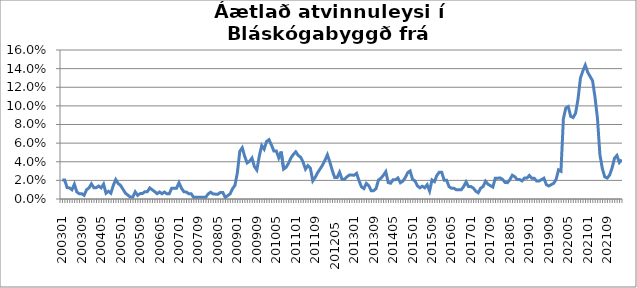
| Category | Series 0 |
|---|---|
| 200301 | 0.02 |
| 200302 | 0.02 |
| 200303 | 0.012 |
| 200304 | 0.012 |
| 200305 | 0.01 |
| 200306 | 0.016 |
| 200307 | 0.008 |
| 200308 | 0.006 |
| 200309 | 0.006 |
| 200310 | 0.004 |
| 200311 | 0.01 |
| 200312 | 0.012 |
| 200401 | 0.016 |
| 200402 | 0.012 |
| 200403 | 0.012 |
| 200404 | 0.014 |
| 200405 | 0.012 |
| 200406 | 0.016 |
| 200407 | 0.006 |
| 200408 | 0.008 |
| 200409 | 0.006 |
| 200410 | 0.015 |
| 200411 | 0.021 |
| 200412 | 0.017 |
| 200501 | 0.015 |
| 200502 | 0.01 |
| 200503 | 0.006 |
| 200504 | 0.004 |
| 200505 | 0.002 |
| 200506 | 0.002 |
| 200507 | 0.008 |
| 200508 | 0.004 |
| 200509 | 0.006 |
| 200510 | 0.006 |
| 200511 | 0.008 |
| 200512 | 0.008 |
| 200601 | 0.012 |
| 200602 | 0.01 |
| 200603 | 0.008 |
| 200604 | 0.006 |
| 200605 | 0.008 |
| 200606 | 0.006 |
| 200607 | 0.007 |
| 200608 | 0.006 |
| 200609 | 0.006 |
| 200610 | 0.012 |
| 200611 | 0.012 |
| 200612 | 0.012 |
| 200701 | 0.017 |
| 200702 | 0.012 |
| 200703 | 0.008 |
| 200704 | 0.008 |
| 200705 | 0.006 |
| 200706 | 0.006 |
| 200707 | 0.002 |
| 200708 | 0.002 |
| 200709 | 0.002 |
| 200710 | 0.002 |
| 200711 | 0.002 |
| 200712 | 0.002 |
| 200801 | 0.005 |
| 200802 | 0.007 |
| 200803 | 0.005 |
| 200804 | 0.005 |
| 200805 | 0.005 |
| 200806 | 0.007 |
| 200807 | 0.007 |
| 200808 | 0.002 |
| 200809 | 0.004 |
| 200810 | 0.005 |
| 200811 | 0.011 |
| 200812 | 0.015 |
| 200901 | 0.028 |
| 200902 | 0.051 |
| 200903 | 0.055 |
| 200904 | 0.046 |
| 200905 | 0.039 |
| 200906 | 0.04 |
| 200907 | 0.044 |
| 200908 | 0.035 |
| 200909 | 0.031 |
| 200910 | 0.046 |
| 200911 | 0.057 |
| 200912 | 0.054 |
| 201001 | 0.062 |
| 201002 | 0.064 |
| 201003 | 0.058 |
| 201004 | 0.052 |
| 201005 | 0.052 |
| 201006 | 0.044 |
| 201007 | 0.051 |
| 201008 | 0.032 |
| 201009 | 0.034 |
| 201010 | 0.038 |
| 201011 | 0.044 |
| 201012 | 0.048 |
| 201101 | 0.051 |
| 201102 | 0.047 |
| 201103 | 0.045 |
| 201104 | 0.04 |
| 201105 | 0.032 |
| 201106 | 0.036 |
| 201107 | 0.033 |
| 201108 | 0.019 |
| 201109 | 0.023 |
| 201110 | 0.028 |
| 201111 | 0.032 |
| 201112 | 0.036 |
| 201201  | 0.042 |
| 201202  | 0.048 |
| 201203  | 0.04 |
| 201204  | 0.031 |
| 201205  | 0.023 |
| 201206  | 0.023 |
| 201207  | 0.029 |
| 201208  | 0.021 |
| 201209  | 0.021 |
| 201210  | 0.024 |
| 201211  | 0.026 |
| 201212  | 0.026 |
| 201301 | 0.026 |
| 201302 | 0.028 |
| 201303 | 0.02 |
| 201304 | 0.013 |
| 201305 | 0.011 |
| 201306 | 0.017 |
| 201307 | 0.014 |
| 201308 | 0.009 |
| 201309 | 0.009 |
| 201310 | 0.011 |
| 201311 | 0.02 |
| 201312 | 0.022 |
| 201401 | 0.025 |
| 201402 | 0.029 |
| 201403 | 0.018 |
| 201404 | 0.017 |
| 201405 | 0.021 |
| 201406 | 0.021 |
| 201407 | 0.023 |
| 201408 | 0.017 |
| 201409 | 0.019 |
| 201410 | 0.023 |
| 201411 | 0.028 |
| 201412 | 0.03 |
| 201501 | 0.021 |
| 201502 | 0.019 |
| 201503 | 0.014 |
| 201504 | 0.012 |
| 201505 | 0.014 |
| 201506 | 0.012 |
| 201507 | 0.015 |
| 201508 | 0.009 |
| 201509 | 0.02 |
| 201510 | 0.019 |
| 201511 | 0.025 |
| 201512 | 0.029 |
| 201601 | 0.029 |
| 201602 | 0.02 |
| 201603 | 0.02 |
| 201604 | 0.013 |
| 201605 | 0.012 |
| 201606 | 0.012 |
| 201607 | 0.01 |
| 201608 | 0.01 |
| 201609 | 0.01 |
| 201610 | 0.013 |
| 201611 | 0.018 |
| 201612 | 0.013 |
| 201701 | 0.013 |
| 201702 | 0.012 |
| 201703 | 0.008 |
| 201704 | 0.007 |
| 201705 | 0.012 |
| 201706 | 0.013 |
| 201707 | 0.019 |
| 201708 | 0.016 |
| 201709 | 0.014 |
| 201710 | 0.013 |
| 201711 | 0.022 |
| 201712 | 0.022 |
| 201801 | 0.023 |
| 201802 | 0.021 |
| 201803 | 0.018 |
| 201804 | 0.018 |
| 201805 | 0.021 |
| 201806 | 0.026 |
| 201807 | 0.024 |
| 201808 | 0.021 |
| 201809 | 0.021 |
| 201810 | 0.019 |
| 201811 | 0.022 |
| 201812 | 0.022 |
| 201901 | 0.025 |
| 201902 | 0.022 |
| 201903 | 0.022 |
| 201904 | 0.019 |
| 201905 | 0.019 |
| 201906 | 0.021 |
| 201907 | 0.022 |
| 201908 | 0.015 |
| 201909 | 0.014 |
| 201910 | 0.015 |
| 201911 | 0.017 |
| 201912 | 0.021 |
| 202001 | 0.031 |
| 202002 | 0.03 |
| 202003 | 0.086 |
| 202004 | 0.098 |
| 202005 | 0.099 |
| 202006 | 0.089 |
| 202007 | 0.087 |
| 202008 | 0.092 |
| 202009 | 0.107 |
| 202010 | 0.13 |
| 202011 | 0.138 |
| 202012 | 0.144 |
| 202101 | 0.136 |
| 202102 | 0.131 |
| 202103 | 0.127 |
| 202104 | 0.109 |
| 202105 | 0.087 |
| 202106 | 0.048 |
| 202107 | 0.033 |
| 202108 | 0.024 |
| 202109 | 0.022 |
| 202110 | 0.026 |
| 202111 | 0.033 |
| 202112 | 0.044 |
| 202201 | 0.047 |
| 202202 | 0.039 |
| 202203 | 0.042 |